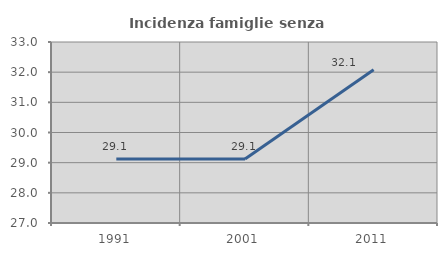
| Category | Incidenza famiglie senza nuclei |
|---|---|
| 1991.0 | 29.124 |
| 2001.0 | 29.121 |
| 2011.0 | 32.079 |